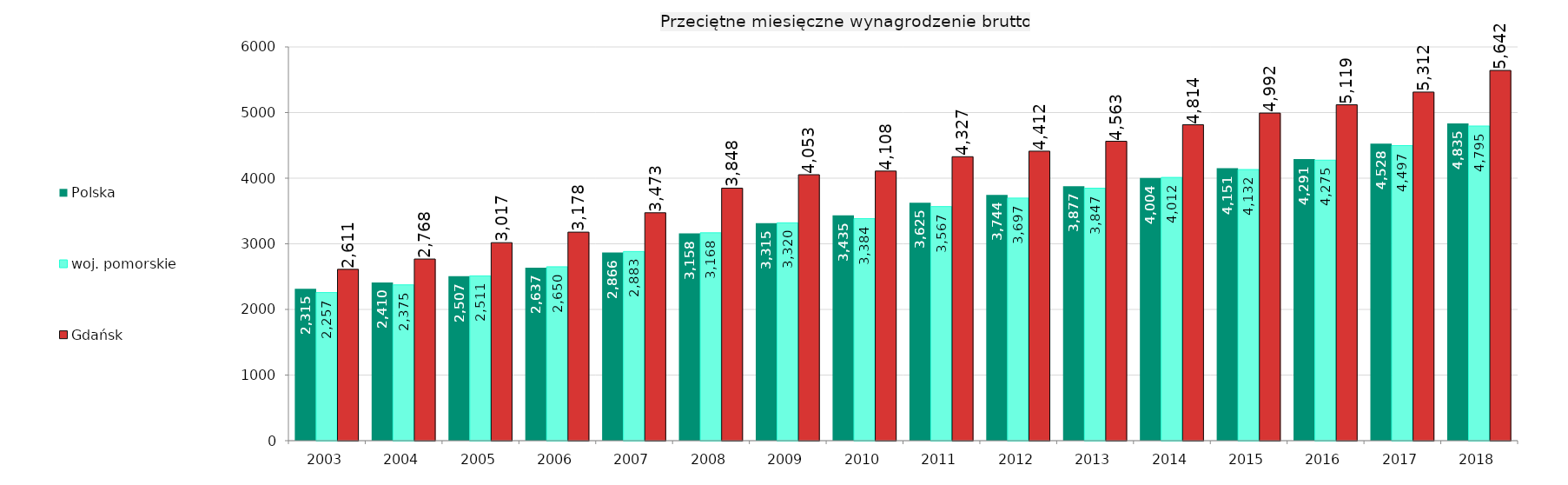
| Category | Polska | woj. pomorskie | Gdańsk |
|---|---|---|---|
| 2003.0 | 2314.66 | 2257.16 | 2611 |
| 2004.0 | 2409.69 | 2374.71 | 2767.68 |
| 2005.0 | 2506.93 | 2511.25 | 3017.45 |
| 2006.0 | 2636.81 | 2650.2 | 3177.7 |
| 2007.0 | 2866.04 | 2882.56 | 3473.08 |
| 2008.0 | 3158.48 | 3167.7 | 3847.9 |
| 2009.0 | 3315.38 | 3320.06 | 4053.17 |
| 2010.0 | 3435 | 3383.58 | 4108.37 |
| 2011.0 | 3625.21 | 3567.49 | 4327.35 |
| 2012.0 | 3744.38 | 3696.89 | 4411.71 |
| 2013.0 | 3877.43 | 3847.12 | 4562.66 |
| 2014.0 | 4003.99 | 4011.59 | 4814.14 |
| 2015.0 | 4150.88 | 4132.13 | 4992.14 |
| 2016.0 | 4290.52 | 4274.73 | 5118.59 |
| 2017.0 | 4527.89 | 4496.64 | 5312.48 |
| 2018.0 | 4834.76 | 4794.74 | 5642 |